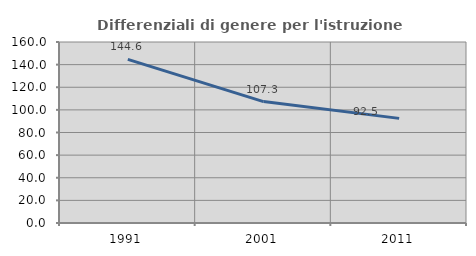
| Category | Differenziali di genere per l'istruzione superiore |
|---|---|
| 1991.0 | 144.592 |
| 2001.0 | 107.347 |
| 2011.0 | 92.489 |